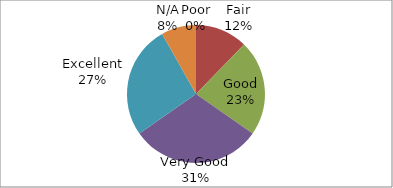
| Category | Series 0 |
|---|---|
| Poor | 0 |
| Fair | 6 |
| Good | 11 |
| Very Good | 15 |
| Excellent | 13 |
| N/A | 4 |